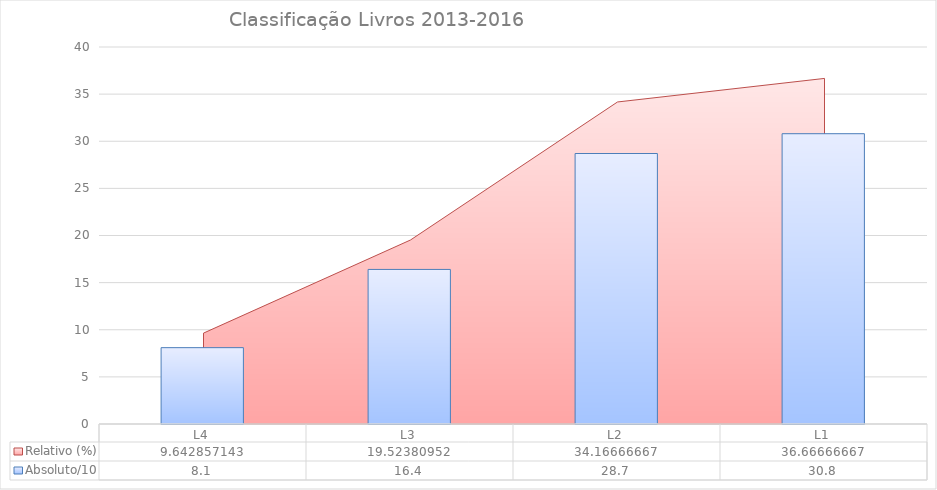
| Category | Absoluto/10 |
|---|---|
| L4 | 8.1 |
| L3 | 16.4 |
| L2 | 28.7 |
| L1 | 30.8 |